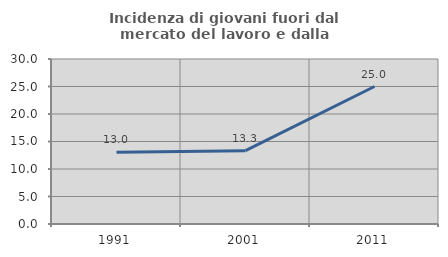
| Category | Incidenza di giovani fuori dal mercato del lavoro e dalla formazione  |
|---|---|
| 1991.0 | 13.043 |
| 2001.0 | 13.333 |
| 2011.0 | 25 |